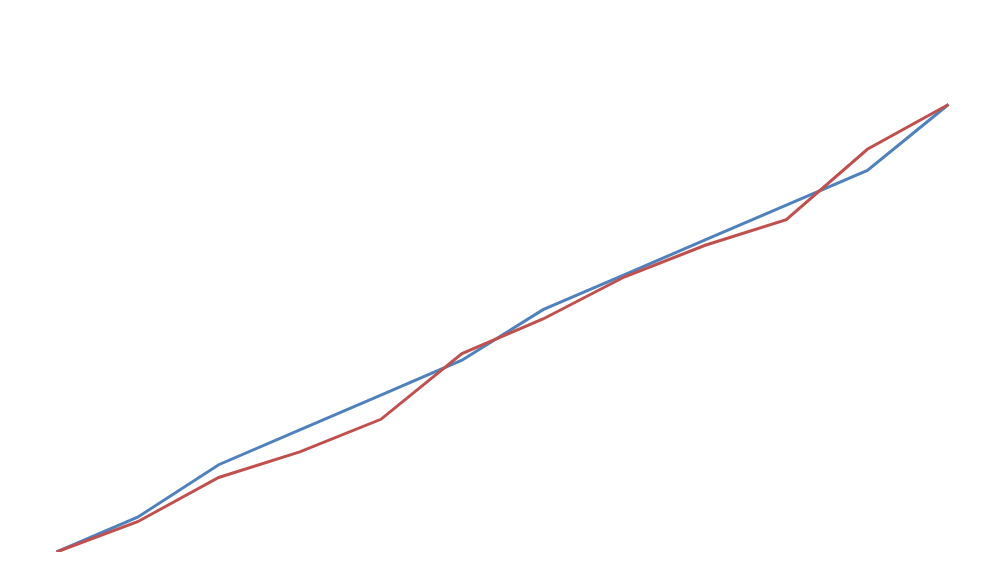
| Category | Rencana Keuangan Kumulatif | Realisasi Keuangan Kumulatif |
|---|---|---|
| 0 | 0 | 0 |
| 1 | 7.782 | 6.76 |
| 2 | 19.506 | 16.66 |
| 3 | 27.288 | 22.378 |
| 4 | 35.071 | 29.651 |
| 5 | 42.853 | 44.34 |
| 6 | 54.159 | 52.07 |
| 7 | 61.941 | 61.45 |
| 8 | 69.724 | 68.55 |
| 9 | 77.506 | 74.27 |
| 10 | 85.289 | 90 |
| 11 | 100 | 100 |